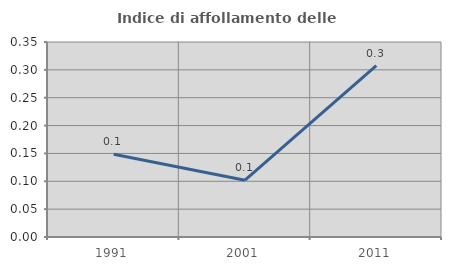
| Category | Indice di affollamento delle abitazioni  |
|---|---|
| 1991.0 | 0.149 |
| 2001.0 | 0.102 |
| 2011.0 | 0.308 |